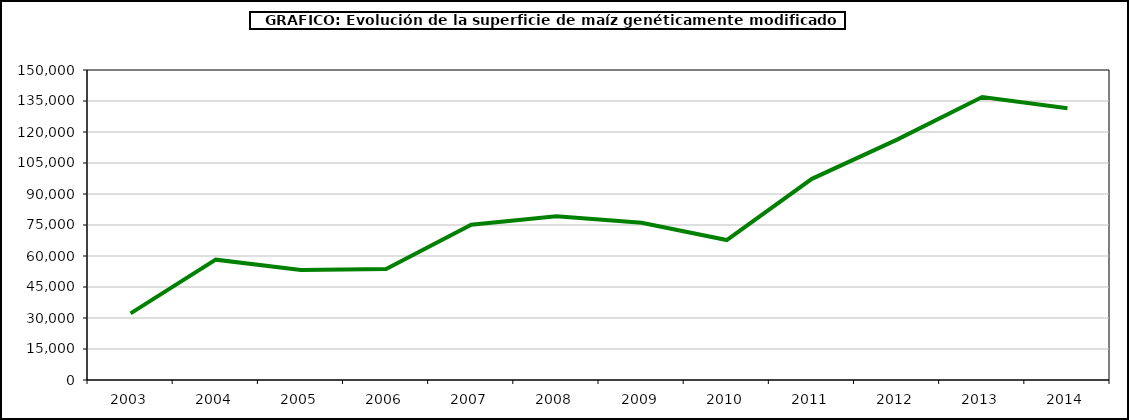
| Category | maiz |
|---|---|
| 2003 | 32249 |
| 2004 | 58219 |
| 2005 | 53226 |
| 2006 | 53667 |
| 2007 | 75148 |
| 2008 | 79269 |
| 2009 | 76057 |
| 2010 | 67726 |
| 2011 | 97346.31 |
| 2012 | 116306.6 |
| 2013 | 136962 |
| 2014 | 131537.67 |